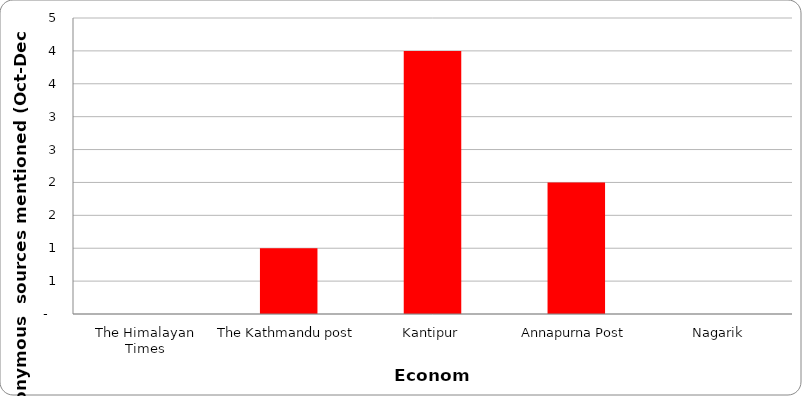
| Category | Economy |
|---|---|
| The Himalayan Times | 0 |
| The Kathmandu post | 1 |
| Kantipur | 4 |
| Annapurna Post | 2 |
| Nagarik | 0 |